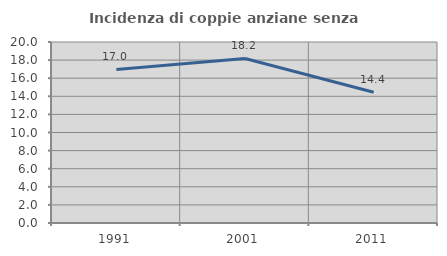
| Category | Incidenza di coppie anziane senza figli  |
|---|---|
| 1991.0 | 16.964 |
| 2001.0 | 18.182 |
| 2011.0 | 14.44 |